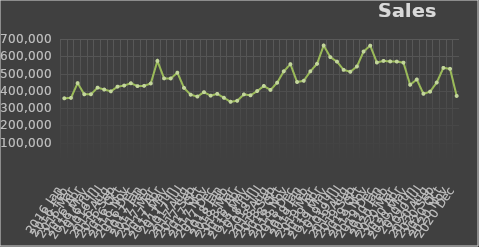
| Category | Total |
|---|---|
| 0 | 357024 |
| 1 | 359209 |
| 2 | 444702 |
| 3 | 380180 |
| 4 | 380280 |
| 5 | 418579 |
| 6 | 407670 |
| 7 | 397188 |
| 8 | 424268 |
| 9 | 430692 |
| 10 | 443981 |
| 11 | 427433 |
| 12 | 428961 |
| 13 | 442608 |
| 14 | 573194 |
| 15 | 472137 |
| 16 | 471642 |
| 17 | 505118 |
| 18 | 417229 |
| 19 | 377721 |
| 20 | 367024 |
| 21 | 392358 |
| 22 | 372118 |
| 23 | 382522 |
| 24 | 359942 |
| 25 | 336794 |
| 26 | 342679 |
| 27 | 379358 |
| 28 | 374121 |
| 29 | 398793 |
| 30 | 428350 |
| 31 | 405314 |
| 32 | 447017 |
| 33 | 512880 |
| 34 | 554246 |
| 35 | 451136 |
| 36 | 458220 |
| 37 | 512914 |
| 38 | 556307 |
| 39 | 662296 |
| 40 | 595185 |
| 41 | 569152 |
| 42 | 521511 |
| 43 | 510373 |
| 44 | 540861 |
| 45 | 627321 |
| 46 | 661577 |
| 47 | 564159 |
| 48 | 573192 |
| 49 | 570127 |
| 50 | 569212 |
| 51 | 563185 |
| 52 | 435335 |
| 53 | 465762 |
| 54 | 383098 |
| 55 | 395212 |
| 56 | 448137 |
| 57 | 532871 |
| 58 | 527498 |
| 59 | 370448 |